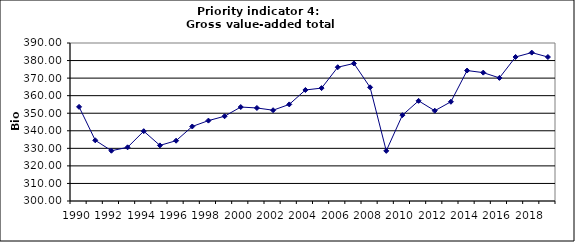
| Category | Gross value-added total industry, Bio Euro (EC95) |
|---|---|
| 1990 | 353.622 |
| 1991 | 334.586 |
| 1992 | 328.64 |
| 1993 | 330.58 |
| 1994 | 339.775 |
| 1995 | 331.676 |
| 1996 | 334.349 |
| 1997 | 342.438 |
| 1998 | 345.785 |
| 1999 | 348.279 |
| 2000 | 353.531 |
| 2001 | 352.992 |
| 2002 | 351.719 |
| 2003 | 355.019 |
| 2004 | 363.237 |
| 2005 | 364.31 |
| 2006 | 376.2 |
| 2007 | 378.351 |
| 2008 | 364.748 |
| 2009 | 328.56 |
| 2010 | 348.893 |
| 2011 | 357.054 |
| 2012 | 351.411 |
| 2013 | 356.532 |
| 2014 | 374.312 |
| 2015 | 373.123 |
| 2016 | 370.123 |
| 2017 | 382.034 |
| 2018 | 384.53 |
| 2019 | 382.012 |